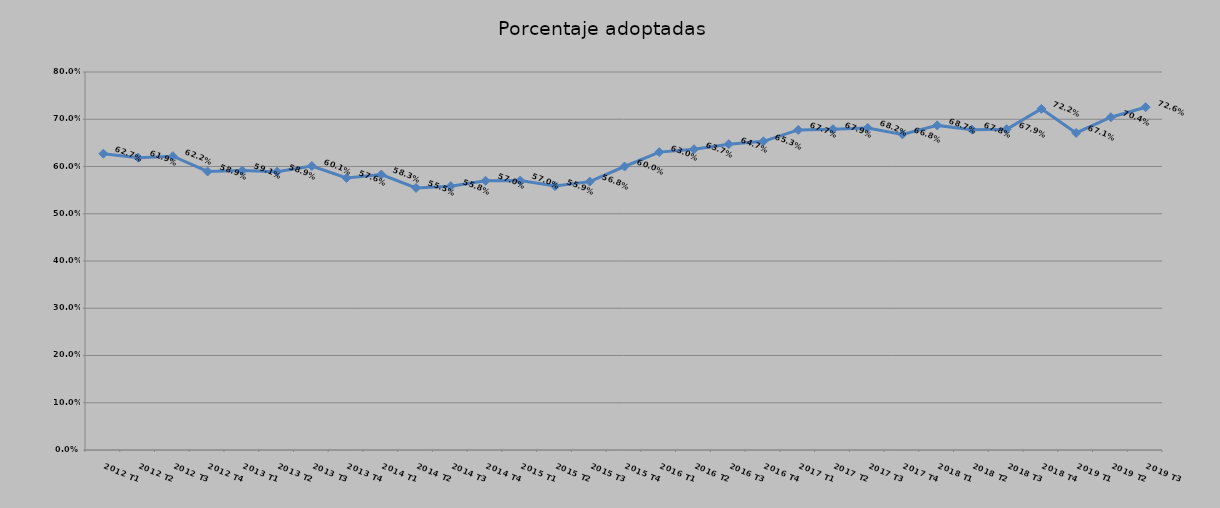
| Category | Porcentaje adoptadas |
|---|---|
| 2012 T1 | 0.627 |
| 2012 T2 | 0.619 |
| 2012 T3 | 0.622 |
| 2012 T4 | 0.589 |
| 2013 T1 | 0.591 |
| 2013 T2 | 0.589 |
| 2013 T3 | 0.601 |
| 2013 T4 | 0.576 |
| 2014 T1 | 0.583 |
| 2014 T2 | 0.555 |
| 2014 T3 | 0.558 |
| 2014 T4 | 0.57 |
| 2015 T1 | 0.57 |
| 2015 T2 | 0.559 |
| 2015 T3 | 0.568 |
| 2015 T4 | 0.6 |
| 2016 T1 | 0.63 |
| 2016 T2 | 0.637 |
| 2016 T3 | 0.647 |
| 2016 T4 | 0.653 |
| 2017 T1 | 0.677 |
| 2017 T2 | 0.679 |
| 2017 T3 | 0.682 |
| 2017 T4 | 0.668 |
| 2018 T1 | 0.687 |
| 2018 T2 | 0.678 |
| 2018 T3 | 0.679 |
| 2018 T4 | 0.722 |
| 2019 T1 | 0.671 |
| 2019 T2 | 0.704 |
| 2019 T3 | 0.726 |